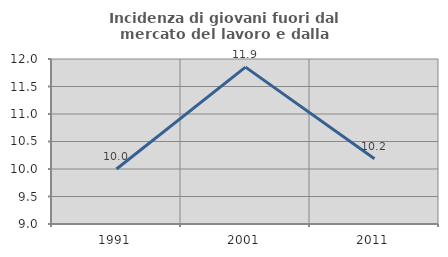
| Category | Incidenza di giovani fuori dal mercato del lavoro e dalla formazione  |
|---|---|
| 1991.0 | 10 |
| 2001.0 | 11.852 |
| 2011.0 | 10.185 |